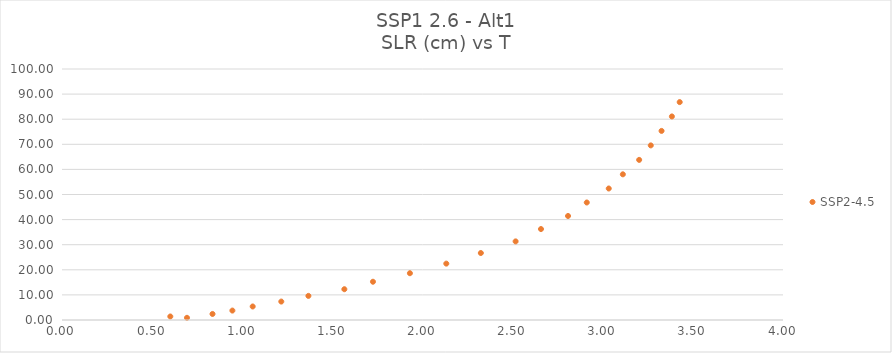
| Category | SSP2-4.5 |
|---|---|
| 0.693400617 | 0.87 |
| 0.600872844 | 1.399 |
| 0.835003234 | 2.407 |
| 0.945258389 | 3.755 |
| 1.057970477 | 5.386 |
| 1.216609042 | 7.344 |
| 1.366998793 | 9.606 |
| 1.566434093 | 12.264 |
| 1.725179017 | 15.242 |
| 1.930157664 | 18.64 |
| 2.132040838 | 22.46 |
| 2.323628479 | 26.685 |
| 2.516628438 | 31.321 |
| 2.657298105 | 36.235 |
| 2.807377579 | 41.443 |
| 2.911363711 | 46.815 |
| 3.033307846 | 52.391 |
| 3.111562119 | 58.041 |
| 3.201994144 | 63.791 |
| 3.266454687 | 69.562 |
| 3.326267987 | 75.335 |
| 3.383598507 | 81.098 |
| 3.426899042 | 86.809 |